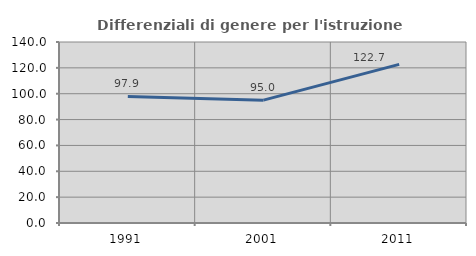
| Category | Differenziali di genere per l'istruzione superiore |
|---|---|
| 1991.0 | 97.927 |
| 2001.0 | 95.024 |
| 2011.0 | 122.685 |